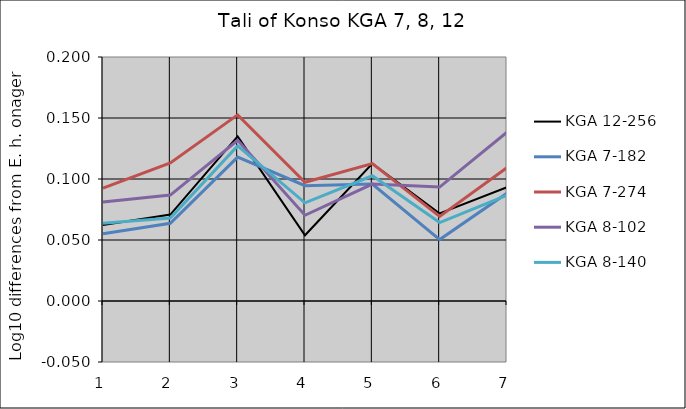
| Category | KGA 12-256 | KGA 7-182 | KGA 7-274 | KGA 8-102 | KGA 8-140 |
|---|---|---|---|---|---|
| 1.0 | 0.062 | 0.055 | 0.093 | 0.081 | 0.064 |
| 2.0 | 0.071 | 0.064 | 0.113 | 0.087 | 0.068 |
| 3.0 | 0.135 | 0.118 | 0.153 | 0.132 | 0.127 |
| 4.0 | 0.054 | 0.095 | 0.097 | 0.07 | 0.08 |
| 5.0 | 0.113 | 0.096 | 0.113 | 0.096 | 0.103 |
| 6.0 | 0.072 | 0.05 | 0.069 | 0.093 | 0.064 |
| 7.0 | 0.093 | 0.088 | 0.109 | 0.138 | 0.087 |